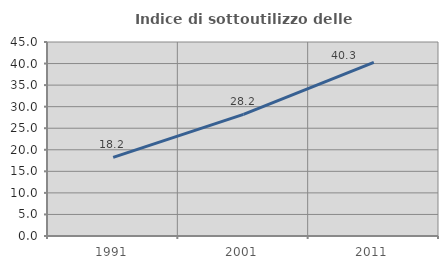
| Category | Indice di sottoutilizzo delle abitazioni  |
|---|---|
| 1991.0 | 18.221 |
| 2001.0 | 28.2 |
| 2011.0 | 40.26 |